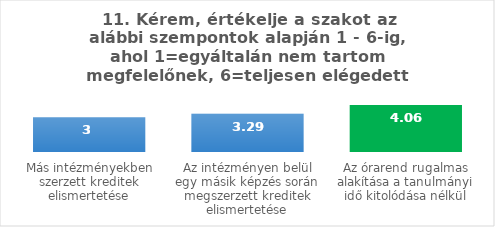
| Category | Series 0 |
|---|---|
| Más intézményekben szerzett kreditek elismertetése | 3 |
| Az intézményen belül egy másik képzés során megszerzett kreditek elismertetése | 3.29 |
| Az órarend rugalmas alakítása a tanulmányi idő kitolódása nélkül | 4.06 |